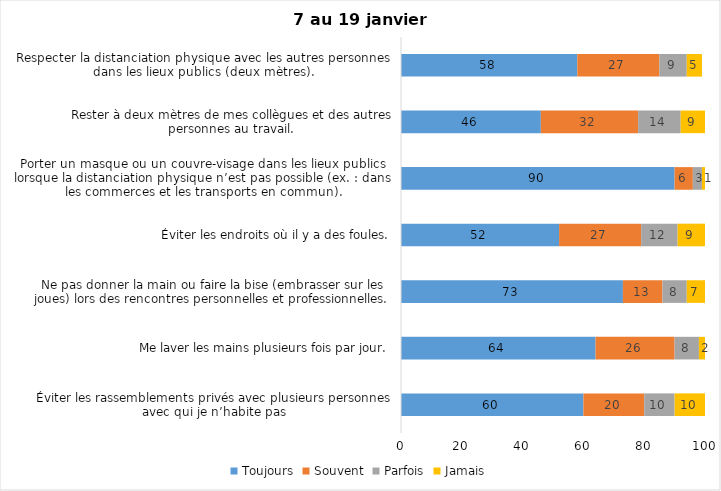
| Category | Toujours | Souvent | Parfois | Jamais |
|---|---|---|---|---|
| Éviter les rassemblements privés avec plusieurs personnes avec qui je n’habite pas | 60 | 20 | 10 | 10 |
| Me laver les mains plusieurs fois par jour. | 64 | 26 | 8 | 2 |
| Ne pas donner la main ou faire la bise (embrasser sur les joues) lors des rencontres personnelles et professionnelles. | 73 | 13 | 8 | 7 |
| Éviter les endroits où il y a des foules. | 52 | 27 | 12 | 9 |
| Porter un masque ou un couvre-visage dans les lieux publics lorsque la distanciation physique n’est pas possible (ex. : dans les commerces et les transports en commun). | 90 | 6 | 3 | 1 |
| Rester à deux mètres de mes collègues et des autres personnes au travail. | 46 | 32 | 14 | 9 |
| Respecter la distanciation physique avec les autres personnes dans les lieux publics (deux mètres). | 58 | 27 | 9 | 5 |